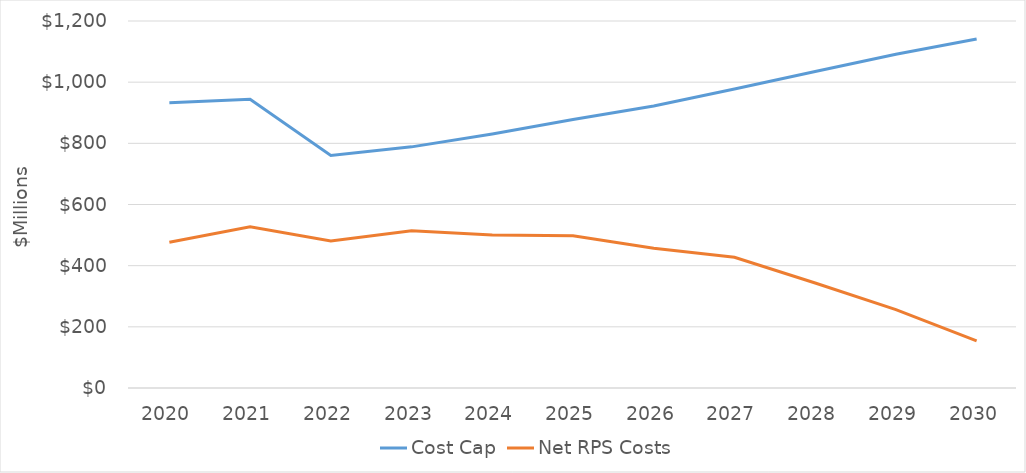
| Category | Cost Cap | Net RPS Costs |
|---|---|---|
| 2020.0 | 932.579 | 476.466 |
| 2021.0 | 944.024 | 526.864 |
| 2022.0 | 760.298 | 480.592 |
| 2023.0 | 788.452 | 513.956 |
| 2024.0 | 830.372 | 500.472 |
| 2025.0 | 878.068 | 497.607 |
| 2026.0 | 922.327 | 457.162 |
| 2027.0 | 977.393 | 427.213 |
| 2028.0 | 1034.889 | 343.358 |
| 2029.0 | 1091.458 | 256.404 |
| 2030.0 | 1141.023 | 154.185 |